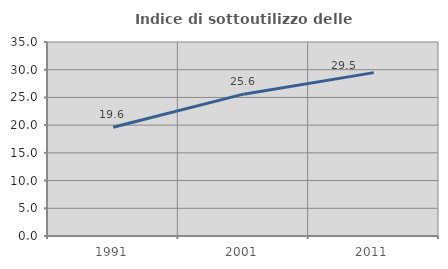
| Category | Indice di sottoutilizzo delle abitazioni  |
|---|---|
| 1991.0 | 19.61 |
| 2001.0 | 25.591 |
| 2011.0 | 29.473 |